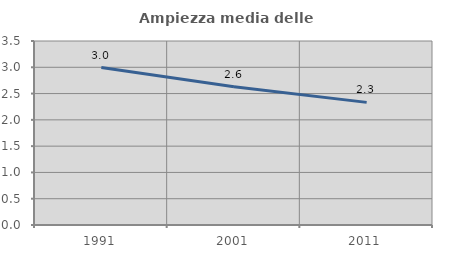
| Category | Ampiezza media delle famiglie |
|---|---|
| 1991.0 | 2.995 |
| 2001.0 | 2.63 |
| 2011.0 | 2.333 |